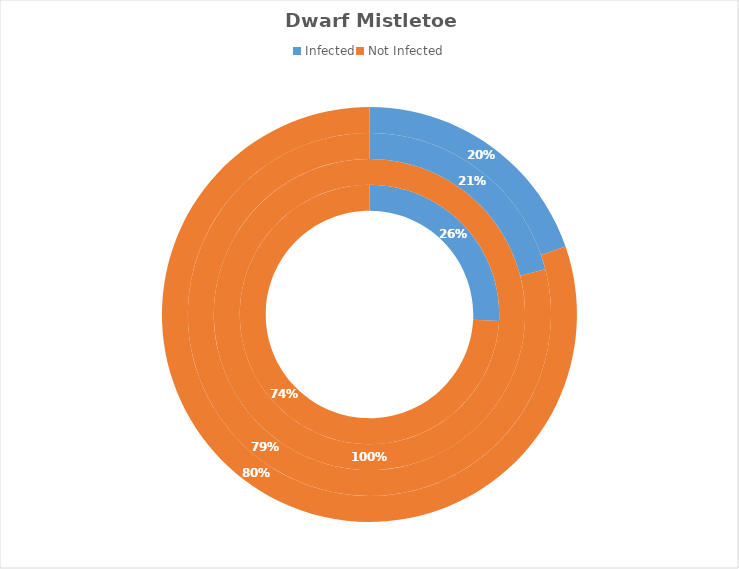
| Category | Transect part A (Ascending North-facing slope) | Transect part B (Ridgeline) | Transect part C (Descending North-facing slope) | Total |
|---|---|---|---|---|
| Infected | 8 | 0 | 17 | 25 |
| Not Infected | 23 | 15 | 64 | 102 |